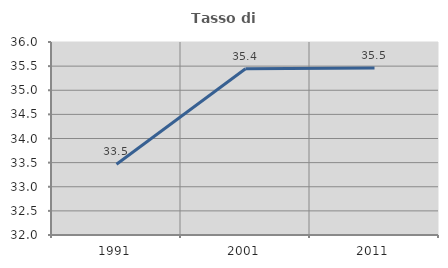
| Category | Tasso di occupazione   |
|---|---|
| 1991.0 | 33.467 |
| 2001.0 | 35.445 |
| 2011.0 | 35.463 |